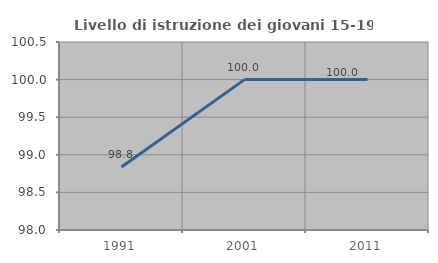
| Category | Livello di istruzione dei giovani 15-19 anni |
|---|---|
| 1991.0 | 98.837 |
| 2001.0 | 100 |
| 2011.0 | 100 |